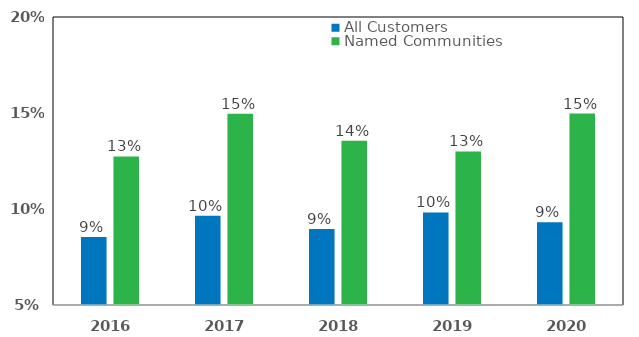
| Category | All Customers | Named Communities |
|---|---|---|
| 2016.0 | 0.085 | 0.127 |
| 2017.0 | 0.097 | 0.15 |
| 2018.0 | 0.09 | 0.135 |
| 2019.0 | 0.098 | 0.13 |
| 2020.0 | 0.093 | 0.15 |